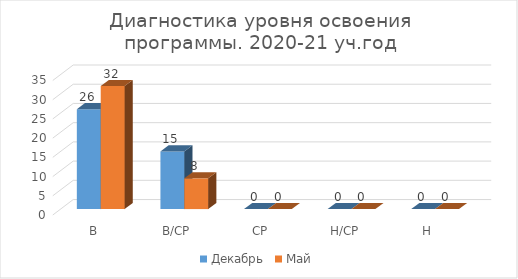
| Category | Декабрь | Май |
|---|---|---|
| В | 26 | 32 |
| В/СР | 15 | 8 |
| СР | 0 | 0 |
| Н/СР | 0 | 0 |
| Н | 0 | 0 |